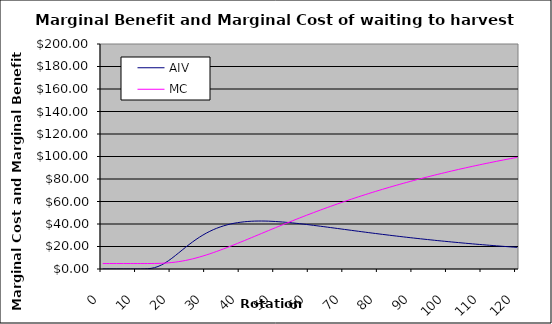
| Category | AIV | MC |
|---|---|---|
| 0.0 | 0 | 4.854 |
| 1.0 | 0 | 4.854 |
| 2.0 | 0 | 4.854 |
| 3.0 | 0 | 4.854 |
| 4.0 | 0 | 4.854 |
| 5.0 | 0 | 4.854 |
| 6.0 | 0 | 4.854 |
| 7.0 | 0 | 4.854 |
| 8.0 | 0 | 4.854 |
| 9.0 | 0 | 4.854 |
| 10.0 | 0.001 | 4.854 |
| 11.0 | 0.009 | 4.854 |
| 12.0 | 0.056 | 4.856 |
| 13.0 | 0.21 | 4.862 |
| 14.0 | 0.566 | 4.879 |
| 15.0 | 1.214 | 4.915 |
| 16.0 | 2.212 | 4.982 |
| 17.0 | 3.575 | 5.089 |
| 18.0 | 5.282 | 5.247 |
| 19.0 | 7.281 | 5.466 |
| 20.0 | 9.507 | 5.751 |
| 21.0 | 11.889 | 6.108 |
| 22.0 | 14.359 | 6.538 |
| 23.0 | 16.856 | 7.044 |
| 24.0 | 19.329 | 7.624 |
| 25.0 | 21.734 | 8.276 |
| 26.0 | 24.041 | 8.997 |
| 27.0 | 26.225 | 9.784 |
| 28.0 | 28.271 | 10.632 |
| 29.0 | 30.168 | 11.537 |
| 30.0 | 31.91 | 12.495 |
| 31.0 | 33.498 | 13.499 |
| 32.0 | 34.933 | 14.547 |
| 33.0 | 36.218 | 15.634 |
| 34.0 | 37.361 | 16.755 |
| 35.0 | 38.367 | 17.906 |
| 36.0 | 39.244 | 19.083 |
| 37.0 | 40 | 20.283 |
| 38.0 | 40.643 | 21.502 |
| 39.0 | 41.182 | 22.738 |
| 40.0 | 41.624 | 23.987 |
| 41.0 | 41.977 | 25.246 |
| 42.0 | 42.248 | 26.513 |
| 43.0 | 42.444 | 27.787 |
| 44.0 | 42.571 | 29.064 |
| 45.0 | 42.637 | 30.343 |
| 46.0 | 42.646 | 31.622 |
| 47.0 | 42.603 | 32.9 |
| 48.0 | 42.515 | 34.176 |
| 49.0 | 42.385 | 35.447 |
| 50.0 | 42.217 | 36.714 |
| 51.0 | 42.016 | 37.974 |
| 52.0 | 41.785 | 39.228 |
| 53.0 | 41.527 | 40.474 |
| 54.0 | 41.245 | 41.711 |
| 55.0 | 40.943 | 42.939 |
| 56.0 | 40.622 | 44.158 |
| 57.0 | 40.285 | 45.367 |
| 58.0 | 39.934 | 46.565 |
| 59.0 | 39.57 | 47.752 |
| 60.0 | 39.197 | 48.928 |
| 61.0 | 38.814 | 50.092 |
| 62.0 | 38.424 | 51.245 |
| 63.0 | 38.028 | 52.386 |
| 64.0 | 37.626 | 53.514 |
| 65.0 | 37.221 | 54.631 |
| 66.0 | 36.813 | 55.735 |
| 67.0 | 36.403 | 56.827 |
| 68.0 | 35.992 | 57.907 |
| 69.0 | 35.58 | 58.975 |
| 70.0 | 35.168 | 60.03 |
| 71.0 | 34.757 | 61.072 |
| 72.0 | 34.347 | 62.103 |
| 73.0 | 33.939 | 63.121 |
| 74.0 | 33.533 | 64.127 |
| 75.0 | 33.129 | 65.121 |
| 76.0 | 32.728 | 66.103 |
| 77.0 | 32.33 | 67.073 |
| 78.0 | 31.935 | 68.031 |
| 79.0 | 31.544 | 68.977 |
| 80.0 | 31.157 | 69.912 |
| 81.0 | 30.773 | 70.835 |
| 82.0 | 30.394 | 71.747 |
| 83.0 | 30.018 | 72.647 |
| 84.0 | 29.647 | 73.537 |
| 85.0 | 29.28 | 74.415 |
| 86.0 | 28.918 | 75.283 |
| 87.0 | 28.56 | 76.139 |
| 88.0 | 28.207 | 76.986 |
| 89.0 | 27.858 | 77.821 |
| 90.0 | 27.514 | 78.647 |
| 91.0 | 27.175 | 79.462 |
| 92.0 | 26.84 | 80.267 |
| 93.0 | 26.51 | 81.063 |
| 94.0 | 26.184 | 81.848 |
| 95.0 | 25.864 | 82.624 |
| 96.0 | 25.547 | 83.39 |
| 97.0 | 25.235 | 84.147 |
| 98.0 | 24.928 | 84.895 |
| 99.0 | 24.625 | 85.634 |
| 100.0 | 24.327 | 86.364 |
| 101.0 | 24.033 | 87.085 |
| 102.0 | 23.744 | 87.797 |
| 103.0 | 23.459 | 88.501 |
| 104.0 | 23.178 | 89.196 |
| 105.0 | 22.901 | 89.883 |
| 106.0 | 22.629 | 90.562 |
| 107.0 | 22.36 | 91.233 |
| 108.0 | 22.096 | 91.896 |
| 109.0 | 21.836 | 92.551 |
| 110.0 | 21.58 | 93.198 |
| 111.0 | 21.327 | 93.838 |
| 112.0 | 21.079 | 94.471 |
| 113.0 | 20.834 | 95.096 |
| 114.0 | 20.593 | 95.713 |
| 115.0 | 20.356 | 96.324 |
| 116.0 | 20.122 | 96.928 |
| 117.0 | 19.892 | 97.524 |
| 118.0 | 19.666 | 98.114 |
| 119.0 | 19.442 | 98.698 |
| 120.0 | 19.223 | 99.274 |